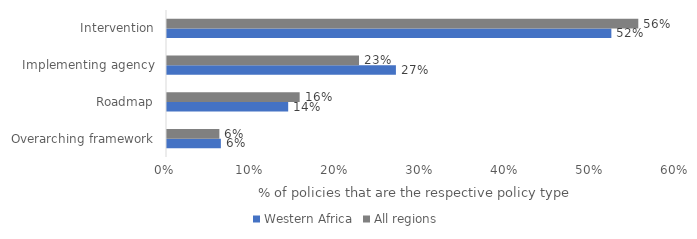
| Category | Western Africa | All regions |
|---|---|---|
| Overarching framework | 0.063 | 0.062 |
| Roadmap | 0.143 | 0.156 |
| Implementing agency | 0.27 | 0.226 |
| Intervention | 0.524 | 0.556 |